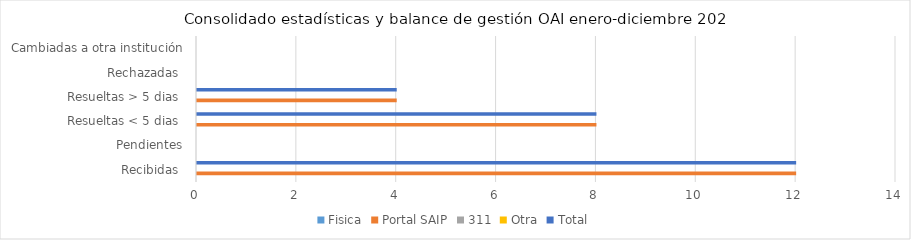
| Category | Fisica | Portal SAIP | 311 | Otra | Total |
|---|---|---|---|---|---|
| Recibidas  | 0 | 12 | 0 | 0 | 12 |
| Pendientes | 0 | 0 | 0 | 0 | 0 |
| Resueltas < 5 dias  | 0 | 8 | 0 | 0 | 8 |
| Resueltas > 5 dias  | 0 | 4 | 0 | 0 | 4 |
| Rechazadas  | 0 | 0 | 0 | 0 | 0 |
| Cambiadas a otra institución | 0 | 0 | 0 | 0 | 0 |